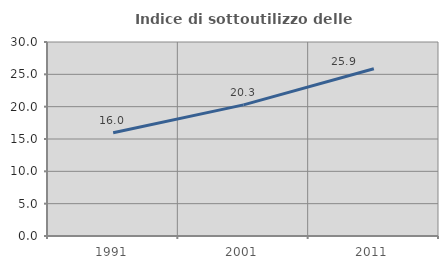
| Category | Indice di sottoutilizzo delle abitazioni  |
|---|---|
| 1991.0 | 15.971 |
| 2001.0 | 20.275 |
| 2011.0 | 25.858 |